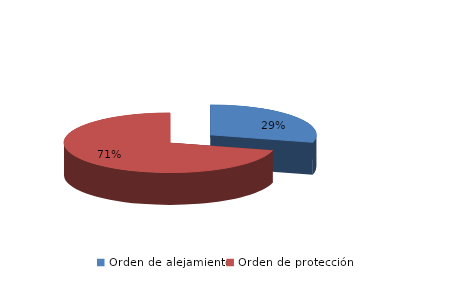
| Category | Series 0 |
|---|---|
| Orden de alejamiento | 272 |
| Orden de protección | 664 |